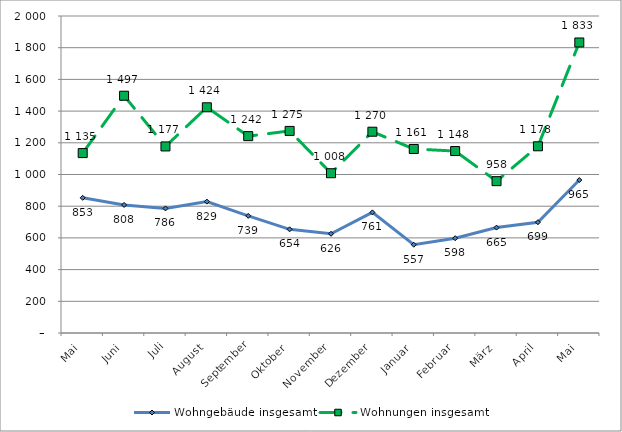
| Category | Wohngebäude insgesamt | Wohnungen insgesamt |
|---|---|---|
| Mai | 853 | 1135 |
| Juni | 808 | 1497 |
| Juli | 786 | 1177 |
| August | 829 | 1424 |
| September | 739 | 1242 |
| Oktober | 654 | 1275 |
| November | 626 | 1008 |
| Dezember | 761 | 1270 |
| Januar | 557 | 1161 |
| Februar | 598 | 1148 |
| März | 665 | 958 |
| April | 699 | 1178 |
| Mai | 965 | 1833 |